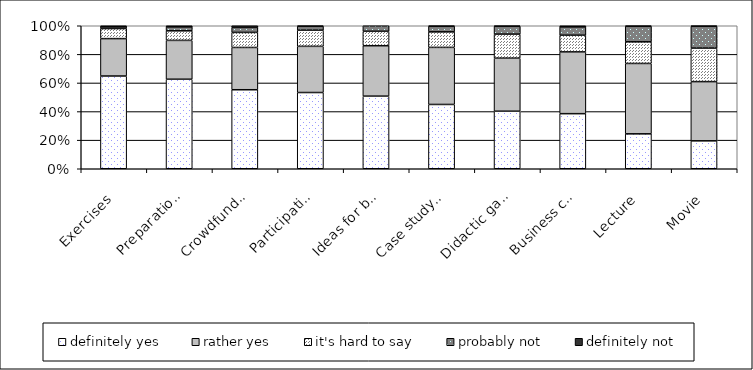
| Category | definitely yes | rather yes | it's hard to say | probably not | definitely not |
|---|---|---|---|---|---|
| Exercises | 166 | 67 | 18 | 3 | 2 |
| Preparation of a business plan | 159 | 69 | 17 | 7 | 2 |
| Crowdfunding project | 142 | 76 | 27 | 9 | 3 |
| Participation of entrepreneurs | 137 | 83 | 29 | 7 | 1 |
| Ideas for business | 131 | 91 | 26 | 10 | 0 |
| Case study of companies' failures | 116 | 103 | 28 | 10 | 1 |
| Didactic games | 103 | 95 | 43 | 14 | 1 |
| Business case study | 99 | 111 | 30 | 15 | 2 |
| Lecture | 63 | 127 | 39 | 28 | 1 |
| Movie | 50 | 106 | 60 | 39 | 1 |